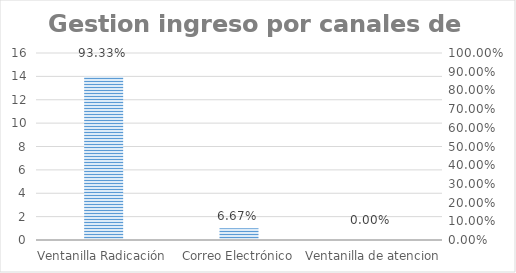
| Category | Series 0 |
|---|---|
| Ventanilla Radicación | 14 |
| Correo Electrónico | 1 |
| Ventanilla de atencion | 0 |